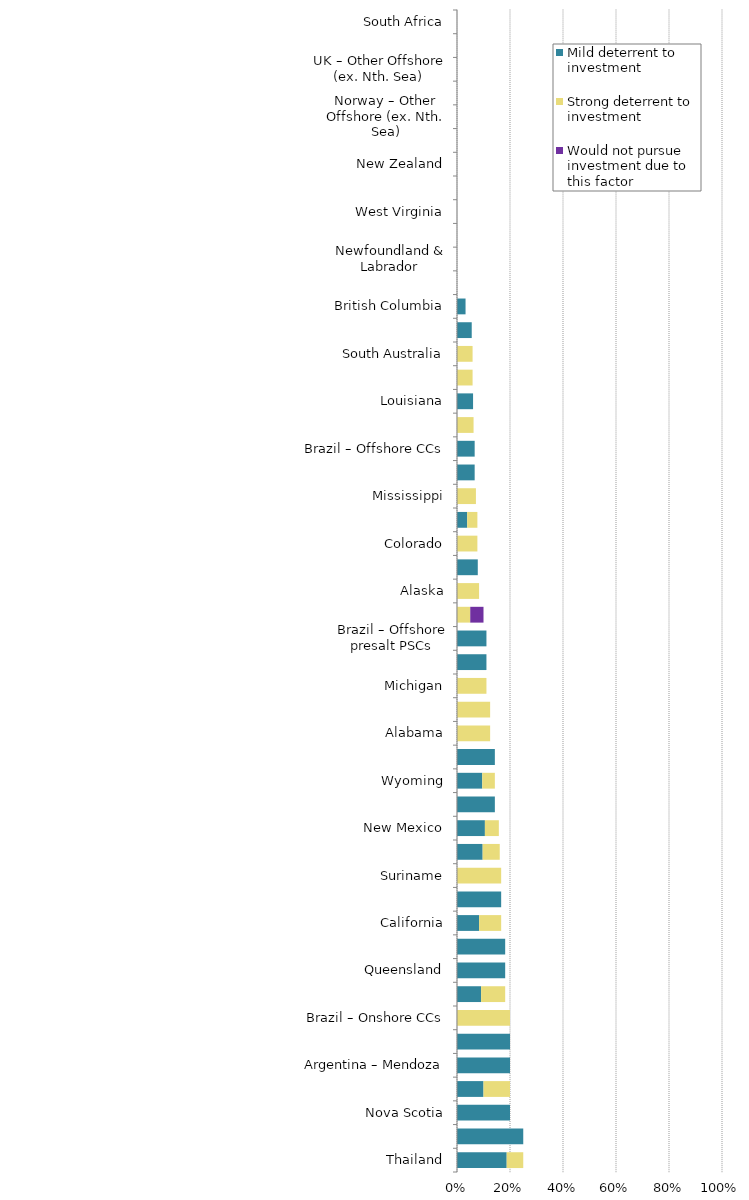
| Category | Mild deterrent to investment | Strong deterrent to investment | Would not pursue investment due to this factor |
|---|---|---|---|
| Thailand | 0.188 | 0.062 | 0 |
| Namibia | 0.25 | 0 | 0 |
| Nova Scotia | 0.2 | 0 | 0 |
| Ohio | 0.1 | 0.1 | 0 |
| Argentina – Mendoza | 0.2 | 0 | 0 |
| Argentina – Santa Cruz | 0.2 | 0 | 0 |
| Brazil – Onshore CCs | 0 | 0.2 | 0 |
| Pennsylvania | 0.091 | 0.091 | 0 |
| Queensland | 0.182 | 0 | 0 |
| Colombia | 0.182 | 0 | 0 |
| California | 0.083 | 0.083 | 0 |
| Kuwait | 0.167 | 0 | 0 |
| Suriname | 0 | 0.167 | 0 |
| Oklahoma | 0.097 | 0.065 | 0 |
| New Mexico | 0.105 | 0.053 | 0 |
| Illinois | 0.143 | 0 | 0 |
| Wyoming | 0.095 | 0.048 | 0 |
| Ivory Coast | 0.143 | 0 | 0 |
| Alabama | 0 | 0.125 | 0 |
| Utah | 0 | 0.125 | 0 |
| Michigan | 0 | 0.111 | 0 |
| Northern Territory | 0.111 | 0 | 0 |
| Brazil – Offshore presalt PSCs | 0.111 | 0 | 0 |
| US Offshore – Gulf of Mexico | 0 | 0.05 | 0.05 |
| Alaska | 0 | 0.083 | 0 |
| Texas | 0.078 | 0 | 0 |
| Colorado | 0 | 0.077 | 0 |
| North Dakota | 0.038 | 0.038 | 0 |
| Mississippi | 0 | 0.071 | 0 |
| Manitoba | 0.067 | 0 | 0 |
| Brazil – Offshore CCs | 0.067 | 0 | 0 |
| Kansas | 0 | 0.062 | 0 |
| Louisiana | 0.061 | 0 | 0 |
| Montana | 0 | 0.059 | 0 |
| South Australia | 0 | 0.059 | 0 |
| Western Australia | 0.056 | 0 | 0 |
| British Columbia | 0.032 | 0 | 0 |
| Alberta | 0 | 0 | 0 |
| Newfoundland & Labrador | 0 | 0 | 0 |
| Saskatchewan | 0 | 0 | 0 |
| West Virginia | 0 | 0 | 0 |
| Australia – Offshore | 0 | 0 | 0 |
| New Zealand | 0 | 0 | 0 |
| Netherlands | 0 | 0 | 0 |
| Norway – Other Offshore (ex. Nth. Sea) | 0 | 0 | 0 |
| Norway – North Sea | 0 | 0 | 0 |
| UK – Other Offshore (ex. Nth. Sea) | 0 | 0 | 0 |
| United Kingdom – North Sea | 0 | 0 | 0 |
| South Africa | 0 | 0 | 0 |